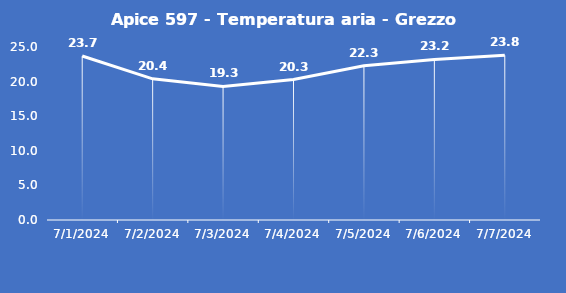
| Category | Apice 597 - Temperatura aria - Grezzo (°C) |
|---|---|
| 7/1/24 | 23.7 |
| 7/2/24 | 20.4 |
| 7/3/24 | 19.3 |
| 7/4/24 | 20.3 |
| 7/5/24 | 22.3 |
| 7/6/24 | 23.2 |
| 7/7/24 | 23.8 |